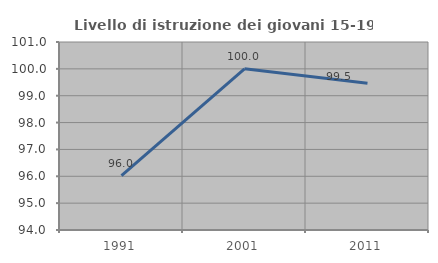
| Category | Livello di istruzione dei giovani 15-19 anni |
|---|---|
| 1991.0 | 96.023 |
| 2001.0 | 100 |
| 2011.0 | 99.465 |